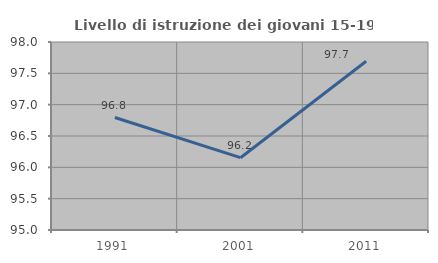
| Category | Livello di istruzione dei giovani 15-19 anni |
|---|---|
| 1991.0 | 96.795 |
| 2001.0 | 96.154 |
| 2011.0 | 97.692 |